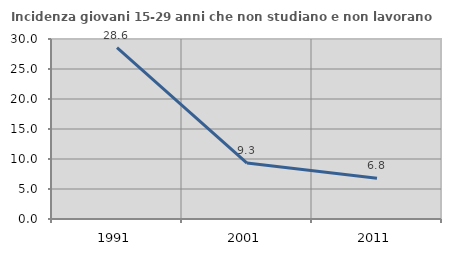
| Category | Incidenza giovani 15-29 anni che non studiano e non lavorano  |
|---|---|
| 1991.0 | 28.571 |
| 2001.0 | 9.321 |
| 2011.0 | 6.78 |